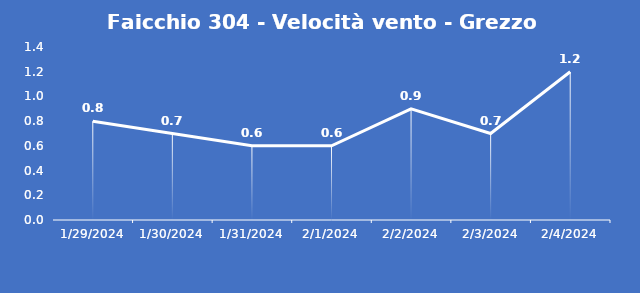
| Category | Faicchio 304 - Velocità vento - Grezzo (m/s) |
|---|---|
| 1/29/24 | 0.8 |
| 1/30/24 | 0.7 |
| 1/31/24 | 0.6 |
| 2/1/24 | 0.6 |
| 2/2/24 | 0.9 |
| 2/3/24 | 0.7 |
| 2/4/24 | 1.2 |